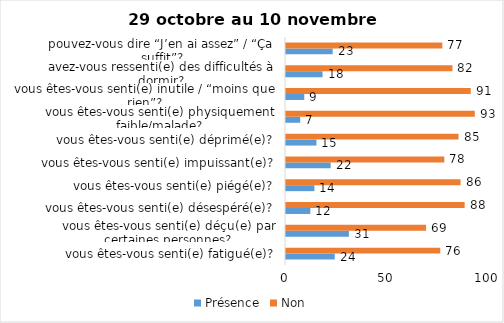
| Category | Présence | Non |
|---|---|---|
| vous êtes-vous senti(e) fatigué(e)? | 24 | 76 |
| vous êtes-vous senti(e) déçu(e) par certaines personnes? | 31 | 69 |
| vous êtes-vous senti(e) désespéré(e)? | 12 | 88 |
| vous êtes-vous senti(e) piégé(e)? | 14 | 86 |
| vous êtes-vous senti(e) impuissant(e)? | 22 | 78 |
| vous êtes-vous senti(e) déprimé(e)? | 15 | 85 |
| vous êtes-vous senti(e) physiquement faible/malade? | 7 | 93 |
| vous êtes-vous senti(e) inutile / “moins que rien”? | 9 | 91 |
| avez-vous ressenti(e) des difficultés à dormir? | 18 | 82 |
| pouvez-vous dire “J’en ai assez” / “Ça suffit”? | 23 | 77 |